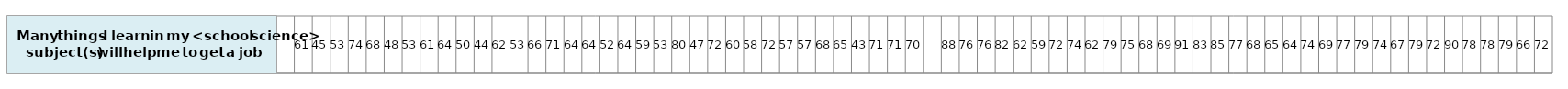
| Category | Many things I learn in my <school science> subject(s) will help me to get a job |
|---|---|
| nan | 1 |
| 61.29531441637903 | 1 |
| 45.19880181262693 | 1 |
| 52.67388436527263 | 1 |
| 73.73230338357676 | 1 |
| 68.09522743523462 | 1 |
| 48.21691256098855 | 1 |
| 53.15920822222277 | 1 |
| 61.01727640127845 | 1 |
| 64.00671050441966 | 1 |
| 50.09436893334621 | 1 |
| 43.75809374685761 | 1 |
| 62.41268783670725 | 1 |
| 53.40936216310826 | 1 |
| 66.24646960429004 | 1 |
| 71.30210885418626 | 1 |
| 64.49009802220992 | 1 |
| 63.95095338711142 | 1 |
| 52.11700256012723 | 1 |
| 63.80912599883082 | 1 |
| 59.11985271750297 | 1 |
| 52.64424869087556 | 1 |
| 79.53642617966014 | 1 |
| 47.06769332500623 | 1 |
| 72.40828730557057 | 1 |
| 59.91130669897824 | 1 |
| 58.44094929063436 | 1 |
| 71.99918047280718 | 1 |
| 56.93765993040636 | 1 |
| 56.50362376019479 | 1 |
| 68.15652010077416 | 1 |
| 64.75588630346762 | 1 |
| 42.81071530096214 | 1 |
| 70.74771069783252 | 1 |
| 71.3097880630786 | 1 |
| 70.19287915537764 | 1 |
| nan | 1 |
| 88.13088092108256 | 1 |
| 75.71901088730223 | 1 |
| 75.7460083098588 | 1 |
| 81.58703245163662 | 1 |
| 62.26724825454129 | 1 |
| 58.66113440718633 | 1 |
| 72.13147953208446 | 1 |
| 74.25850548713882 | 1 |
| 62.05466471770968 | 1 |
| 78.98041176208508 | 1 |
| 74.6027388741801 | 1 |
| 68.0561366919429 | 1 |
| 69.11432410052485 | 1 |
| 90.74508364229268 | 1 |
| 82.80113814599345 | 1 |
| 85.37950885969116 | 1 |
| 77.34584511706902 | 1 |
| 67.945979606883 | 1 |
| 65.37417689215432 | 1 |
| 64.04287960687097 | 1 |
| 73.65052916915987 | 1 |
| 68.8173151146406 | 1 |
| 76.71959482807317 | 1 |
| 78.82358455737244 | 1 |
| 73.94965732555771 | 1 |
| 66.77802928990064 | 1 |
| 79.33831339484915 | 1 |
| 71.90769435385789 | 1 |
| 89.68816092223466 | 1 |
| 77.89441067143412 | 1 |
| 78.47421405545792 | 1 |
| 79.39608138383103 | 1 |
| 66.34356481092979 | 1 |
| 72.18833070571681 | 1 |